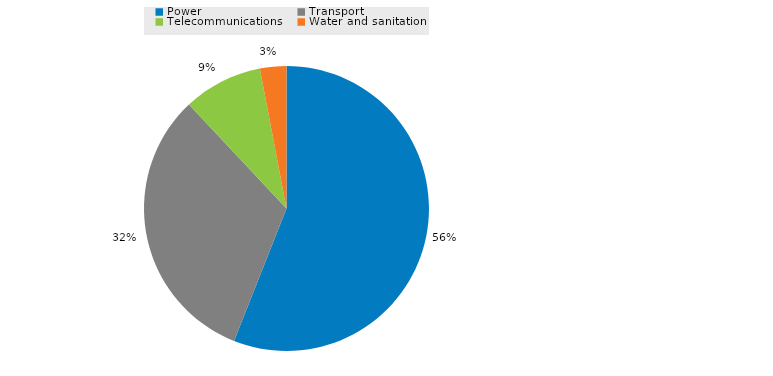
| Category | % |
|---|---|
| Power | 0.56 |
| Transport | 0.32 |
| Telecommunications | 0.09 |
| Water and sanitation | 0.03 |